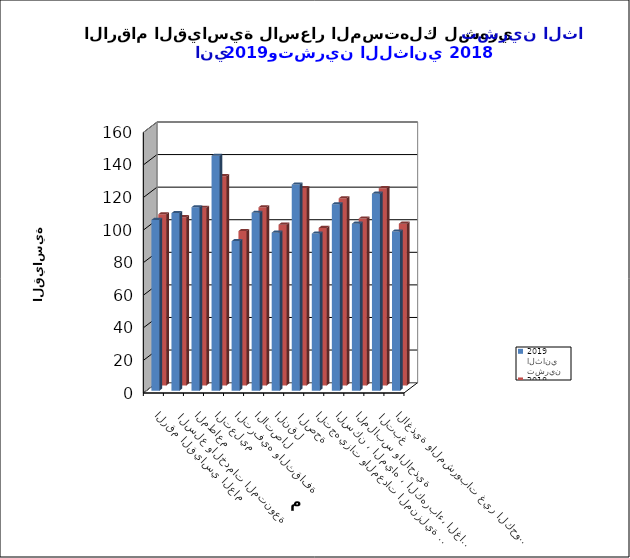
| Category | تشرين الثاني  2019      |  تشرين الثاني   2018 |
|---|---|---|
| الاغذية والمشروبات غير الكحولية | 97.7 | 99.3 |
|  التبغ | 120.9 | 121.1 |
| الملابس والاحذية | 102.5 | 102.5 |
| السكن ، المياه ، الكهرباء، الغاز  | 114.4 | 114.9 |
| التجهيزات والمعدات المنزلية والصيانة | 96.4 | 96.7 |
|  الصحة | 126.5 | 121.2 |
| النقل | 97 | 98.7 |
| الاتصال | 109.2 | 109.4 |
| الترفيه والثقافة | 91.8 | 94.8 |
| التعليم | 144.2 | 128.5 |
| المطاعم  | 112.6 | 109.1 |
|  السلع والخدمات المتنوعة | 109 | 103.3 |
| الرقم القياسي العام | 104.8 | 105.1 |